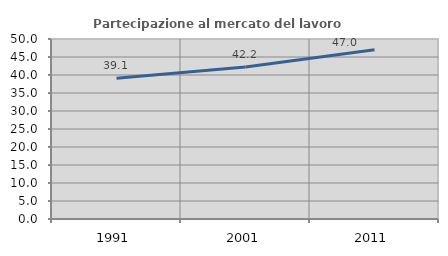
| Category | Partecipazione al mercato del lavoro  femminile |
|---|---|
| 1991.0 | 39.081 |
| 2001.0 | 42.233 |
| 2011.0 | 46.986 |